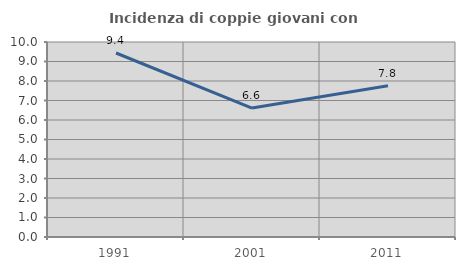
| Category | Incidenza di coppie giovani con figli |
|---|---|
| 1991.0 | 9.436 |
| 2001.0 | 6.612 |
| 2011.0 | 7.752 |